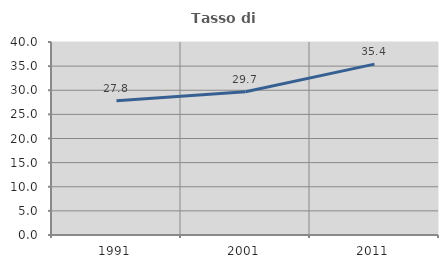
| Category | Tasso di occupazione   |
|---|---|
| 1991.0 | 27.82 |
| 2001.0 | 29.693 |
| 2011.0 | 35.42 |